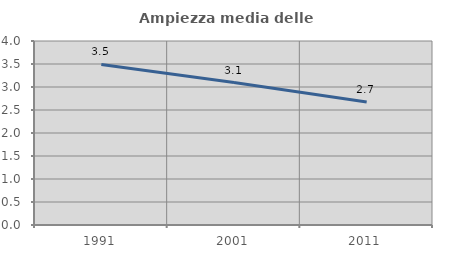
| Category | Ampiezza media delle famiglie |
|---|---|
| 1991.0 | 3.49 |
| 2001.0 | 3.097 |
| 2011.0 | 2.676 |